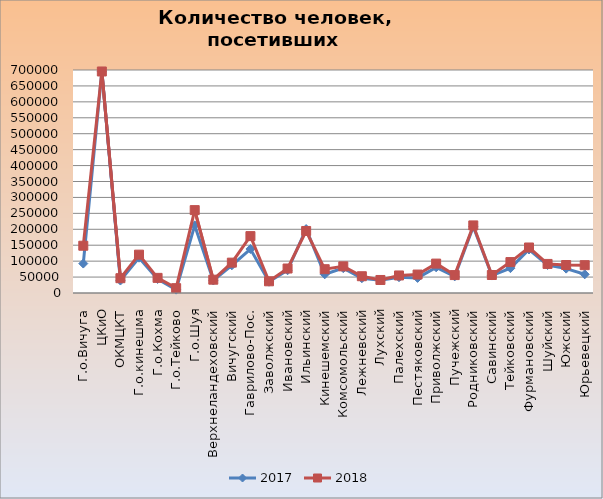
| Category | 2017 | 2018 |
|---|---|---|
| Г.о.Вичуга | 92449 | 148370 |
| ЦКиО | 695350 | 695350 |
| ОКМЦКТ | 39100 | 46479 |
| Г.о.кинешма | 110850 | 120402 |
| Г.о.Кохма | 44002 | 47500 |
| Г.о.Тейково | 10563 | 15213 |
| Г.о.Шуя | 212190 | 260170 |
| Верхнеландеховский | 39239 | 41755 |
| Вичугский | 86910 | 95288 |
| Гаврилово-Пос. | 138102 | 178540 |
| Заволжский | 35488 | 36688 |
| Ивановский | 71378 | 76855 |
| Ильинский | 200667 | 194687 |
| Кинешемский | 58731 | 74722 |
| Комсомольский | 77849 | 83662 |
| Лежневский | 46391 | 52630 |
| Лухский | 39798 | 40891 |
| Палехский | 49491 | 55074 |
| Пестяковский | 47322 | 57915 |
| Приволжский | 80591 | 92265 |
| Пучежский | 52194 | 56244 |
| Родниковский | 208332 | 212172 |
| Савинский | 54800 | 56466 |
| Тейковский | 77970 | 97089 |
| Фурмановский | 136535 | 142829 |
| Шуйский | 87875 | 91268 |
| Южский | 76504 | 87854 |
| Юрьевецкий | 58701 | 87367 |